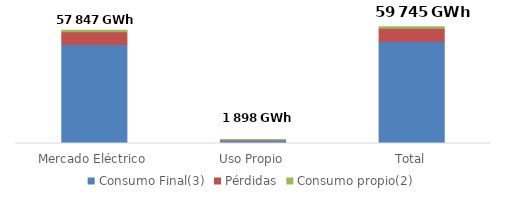
| Category | Consumo Final(3) | Pérdidas | Consumo propio(2) |
|---|---|---|---|
| Mercado Eléctrico | 50593.33 | 6527.354 | 689.793 |
| Uso Propio | 1652.847 | 109.43 | 135.839 |
| Total | 52246.176 | 6636.784 | 825.632 |